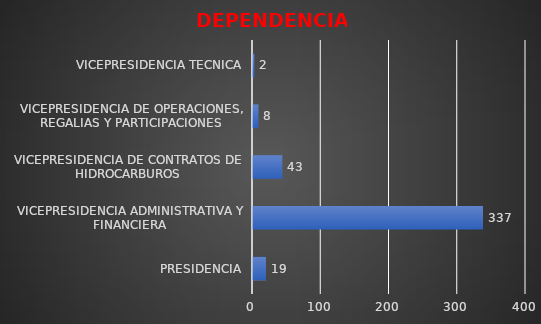
| Category | Series 0 |
|---|---|
| PRESIDENCIA | 19 |
| VICEPRESIDENCIA ADMINISTRATIVA Y FINANCIERA | 337 |
| VICEPRESIDENCIA DE CONTRATOS DE HIDROCARBUROS | 43 |
| VICEPRESIDENCIA DE OPERACIONES, REGALIAS Y PARTICIPACIONES | 8 |
| VICEPRESIDENCIA TECNICA | 2 |